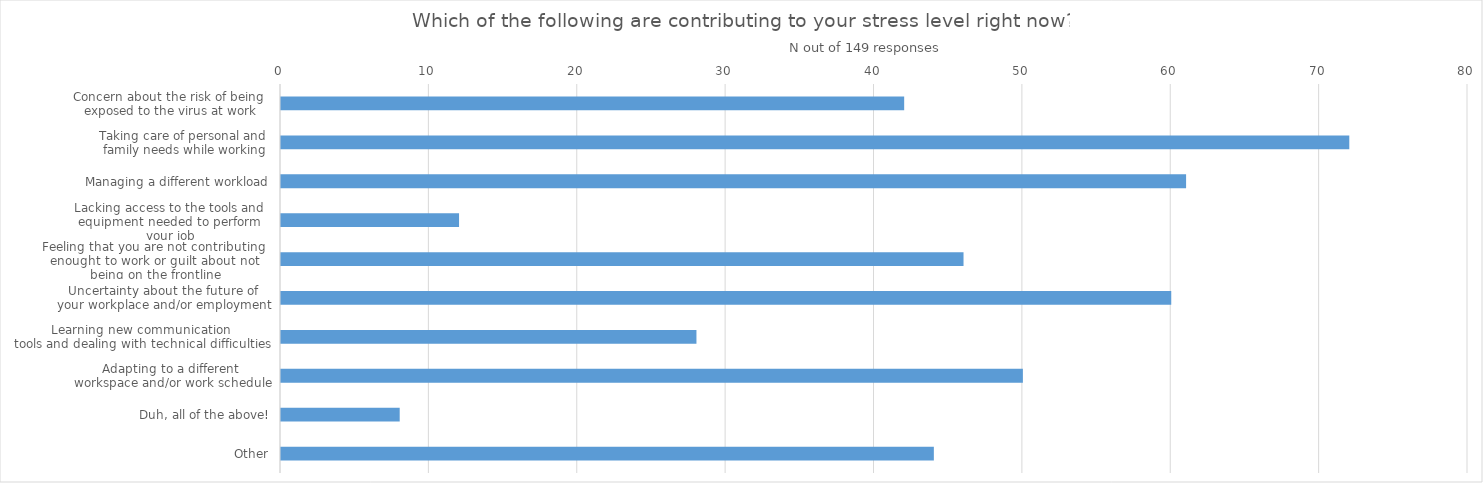
| Category | All Responses |
|---|---|
| Concern about the risk of being 
exposed to the virus at work | 42 |
| Taking care of personal and
 family needs while working | 72 |
| Managing a different workload | 61 |
| Lacking access to the tools and 
equipment needed to perform 
your job | 12 |
| Feeling that you are not contributing 
enought to work or guilt about not 
being on the frontline | 46 |
| Uncertainty about the future of 
your workplace and/or employment | 60 |
| Learning new communication 
tools and dealing with technical difficulties | 28 |
| Adapting to a different 
workspace and/or work schedule | 50 |
| Duh, all of the above! | 8 |
| Other | 44 |